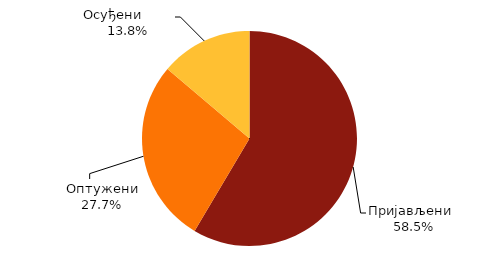
| Category | Series 0 |
|---|---|
| Пријављени   | 216 |
| Оптужени | 102 |
| Осуђени        | 51 |